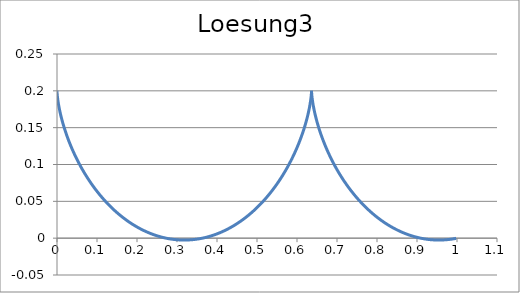
| Category | Loesung3 |
|---|---|
| 0.0 | 0.2 |
| 1.350358627920312e-07 | 0.2 |
| 1.0802220869125487e-06 | 0.2 |
| 3.6453849843475664e-06 | 0.2 |
| 8.639702898011676e-06 | 0.2 |
| 1.687138254120537e-05 | 0.199 |
| 2.9147335725695078e-05 | 0.199 |
| 4.627285660776096e-05 | 0.199 |
| 6.905129958125677e-05 | 0.199 |
| 9.828375794657843e-05 | 0.198 |
| 0.00013476874348401365 | 0.198 |
| 0.00017930186705967618 | 0.198 |
| 0.00023267552039178043 | 0.197 |
| 0.0002956785591045027 | 0.197 |
| 0.00036909598719626414 | 0.196 |
| 0.0004537086430485867 | 0.195 |
| 0.0005502928871011515 | 0.195 |
| 0.0006596202913179884 | 0.194 |
| 0.0007824573305689601 | 0.194 |
| 0.0009195650760500436 | 0.193 |
| 0.0010716988908650023 | 0.192 |
| 0.0012396081278902092 | 0.191 |
| 0.0014240358300434779 | 0.19 |
| 0.0016257184330768328 | 0.189 |
| 0.0018453854710119917 | 0.189 |
| 0.002083759284336518 | 0.188 |
| 0.0023415547310772214 | 0.187 |
| 0.0026194789008665057 | 0.186 |
| 0.0029182308321159525 | 0.185 |
| 0.0032385012324102043 | 0.183 |
| 0.0035809722022332644 | 0.182 |
| 0.003946316962137287 | 0.181 |
| 0.004335199583463373 | 0.18 |
| 0.004748274722721914 | 0.179 |
| 0.005186187359738653 | 0.177 |
| 0.005649572539671434 | 0.176 |
| 0.006139055119000535 | 0.175 |
| 0.006655249515594441 | 0.174 |
| 0.007198759462950897 | 0.172 |
| 0.007770177768711531 | 0.171 |
| 0.008370086077546713 | 0.169 |
| 0.008999054638505468 | 0.168 |
| 0.009657642076923408 | 0.166 |
| 0.0103463951709801 | 0.165 |
| 0.011065848632995038 | 0.163 |
| 0.01181652489554988 | 0.162 |
| 0.012598933902522359 | 0.16 |
| 0.013413572905115531 | 0.158 |
| 0.01426092626296395 | 0.157 |
| 0.015141465250396243 | 0.155 |
| 0.016055647867931677 | 0.153 |
| 0.017003918659086036 | 0.152 |
| 0.01798670853256019 | 0.15 |
| 0.019004434589882307 | 0.148 |
| 0.020057499958572825 | 0.146 |
| 0.02114629363089883 | 0.145 |
| 0.02227119030828232 | 0.143 |
| 0.023432550251424634 | 0.141 |
| 0.02463071913620699 | 0.139 |
| 0.025866027915424708 | 0.137 |
| 0.027138792686410552 | 0.135 |
| 0.028449314564599953 | 0.134 |
| 0.029797879563088926 | 0.132 |
| 0.03118475847823255 | 0.13 |
| 0.032610206781330135 | 0.128 |
| 0.034074464516440015 | 0.126 |
| 0.03557775620436522 | 0.124 |
| 0.03712029075284805 | 0.122 |
| 0.038702261373009854 | 0.12 |
| 0.04032384550206909 | 0.118 |
| 0.041985204732368865 | 0.116 |
| 0.043686484746742076 | 0.114 |
| 0.04542781526024027 | 0.112 |
| 0.04720930996824936 | 0.11 |
| 0.04903106650101298 | 0.108 |
| 0.05089316638458163 | 0.106 |
| 0.05279567500820344 | 0.104 |
| 0.05473864159816927 | 0.102 |
| 0.056722099198122884 | 0.1 |
| 0.05874606465584393 | 0.098 |
| 0.06081053861650904 | 0.096 |
| 0.06291550552243376 | 0.094 |
| 0.06506093361929542 | 0.092 |
| 0.06724677496883455 | 0.09 |
| 0.06947296546802931 | 0.088 |
| 0.07173942487473607 | 0.086 |
| 0.07404605683978505 | 0.084 |
| 0.0763927489455188 | 0.082 |
| 0.07877937275075772 | 0.08 |
| 0.08120578384217479 | 0.078 |
| 0.08367182189205906 | 0.076 |
| 0.08617731072244451 | 0.074 |
| 0.08872205837557891 | 0.072 |
| 0.09130585719070441 | 0.07 |
| 0.09392848388711901 | 0.068 |
| 0.09658969965348595 | 0.066 |
| 0.09928925024335493 | 0.064 |
| 0.1020268660768574 | 0.062 |
| 0.10480226234853492 | 0.06 |
| 0.10761513914125745 | 0.058 |
| 0.11046518154618629 | 0.057 |
| 0.11335205978873343 | 0.055 |
| 0.11627542936046689 | 0.053 |
| 0.11923493115690964 | 0.051 |
| 0.12223019162117642 | 0.049 |
| 0.1252608228933917 | 0.048 |
| 0.12832642296582836 | 0.046 |
| 0.13142657584370537 | 0.044 |
| 0.13456085171158033 | 0.042 |
| 0.13772880710526966 | 0.041 |
| 0.14092998508922874 | 0.039 |
| 0.14416391543931956 | 0.037 |
| 0.14743011483089447 | 0.036 |
| 0.15072808703211937 | 0.034 |
| 0.15405732310246026 | 0.033 |
| 0.1574173015962519 | 0.031 |
| 0.16080748877126982 | 0.03 |
| 0.1642273388022198 | 0.028 |
| 0.16767629399906067 | 0.027 |
| 0.17115378503007309 | 0.025 |
| 0.1746592311495844 | 0.024 |
| 0.17819204043025938 | 0.023 |
| 0.1817516099998631 | 0.021 |
| 0.18533732628240185 | 0.02 |
| 0.18894856524354545 | 0.019 |
| 0.1925846926402325 | 0.018 |
| 0.19624506427435928 | 0.016 |
| 0.1999290262504503 | 0.015 |
| 0.2036359152372078 | 0.014 |
| 0.2073650587328356 | 0.013 |
| 0.2111157753340304 | 0.012 |
| 0.21488737500853458 | 0.011 |
| 0.21867915937113955 | 0.01 |
| 0.22249042196303054 | 0.009 |
| 0.22632044853436087 | 0.008 |
| 0.23016851732994217 | 0.007 |
| 0.23403389937793706 | 0.006 |
| 0.2379158587814379 | 0.005 |
| 0.2418136530128158 | 0.005 |
| 0.24572653321072224 | 0.004 |
| 0.24965374447962285 | 0.003 |
| 0.25359452619174605 | 0.003 |
| 0.2575481122913239 | 0.002 |
| 0.26151373160100433 | 0.001 |
| 0.26549060813031145 | 0.001 |
| 0.2694779613860317 | 0 |
| 0.2734750066844007 | 0 |
| 0.2774809554649663 | -0.001 |
| 0.281495015606002 | -0.001 |
| 0.2855163917413453 | -0.001 |
| 0.2895442855785337 | -0.002 |
| 0.2935778962181106 | -0.002 |
| 0.29761642047397485 | -0.002 |
| 0.30165905319464426 | -0.002 |
| 0.3057049875853055 | -0.002 |
| 0.3097534155305212 | -0.002 |
| 0.3138035279174656 | -0.003 |
| 0.31785451495955835 | -0.003 |
| 0.3219055665203691 | -0.003 |
| 0.32595587243766067 | -0.002 |
| 0.33000462284744336 | -0.002 |
| 0.3340510085079097 | -0.002 |
| 0.3380942211231205 | -0.002 |
| 0.3421334536663123 | -0.002 |
| 0.34616790070269754 | -0.002 |
| 0.3501967587116273 | -0.001 |
| 0.3542192264079894 | -0.001 |
| 0.35823450506271126 | -0.001 |
| 0.3622417988222413 | 0 |
| 0.3662403150268793 | 0 |
| 0.37022926452783017 | 0.001 |
| 0.3742078620028528 | 0.001 |
| 0.3781753262703782 | 0.002 |
| 0.3821308806019721 | 0.003 |
| 0.38607375303301567 | 0.003 |
| 0.39000317667148143 | 0.004 |
| 0.3939183900046794 | 0.005 |
| 0.3978186372038523 | 0.005 |
| 0.401703168426497 | 0.006 |
| 0.40557124011629136 | 0.007 |
| 0.409422115300507 | 0.008 |
| 0.4132550638847882 | 0.009 |
| 0.41706936294518066 | 0.01 |
| 0.42086429701729067 | 0.011 |
| 0.42463915838246163 | 0.012 |
| 0.4283932473508522 | 0.013 |
| 0.43212587254130275 | 0.014 |
| 0.4358363511578788 | 0.015 |
| 0.43952400926297963 | 0.016 |
| 0.4431881820469055 | 0.017 |
| 0.4468282140937717 | 0.019 |
| 0.4504434596436662 | 0.02 |
| 0.45403328285094585 | 0.021 |
| 0.4575970580385651 | 0.022 |
| 0.4611341699483393 | 0.024 |
| 0.46464401398703903 | 0.025 |
| 0.4681259964682202 | 0.027 |
| 0.4715795348496899 | 0.028 |
| 0.475004057966516 | 0.03 |
| 0.47839900625948545 | 0.031 |
| 0.4817638319989202 | 0.033 |
| 0.485097999503762 | 0.034 |
| 0.48840098535583804 | 0.036 |
| 0.49167227860922036 | 0.037 |
| 0.4949113809945983 | 0.039 |
| 0.4981178071185788 | 0.041 |
| 0.5012910846578382 | 0.042 |
| 0.5044307545480442 | 0.044 |
| 0.5075363711674766 | 0.046 |
| 0.5106075025152689 | 0.047 |
| 0.5136437303842039 | 0.049 |
| 0.5166446505279901 | 0.051 |
| 0.5196098728229562 | 0.053 |
| 0.5225390214240933 | 0.054 |
| 0.5254317349153897 | 0.056 |
| 0.5282876664543921 | 0.058 |
| 0.5311064839109368 | 0.06 |
| 0.5338878699999993 | 0.062 |
| 0.5366315224086023 | 0.064 |
| 0.5393371539167376 | 0.066 |
| 0.5420044925122508 | 0.068 |
| 0.5446332814996412 | 0.07 |
| 0.5472232796027381 | 0.071 |
| 0.5497742610612067 | 0.073 |
| 0.5522860157208505 | 0.075 |
| 0.5547583491176686 | 0.077 |
| 0.5571910825556406 | 0.079 |
| 0.5595840531782011 | 0.081 |
| 0.5619371140333808 | 0.083 |
| 0.5642501341325851 | 0.085 |
| 0.566522998502988 | 0.087 |
| 0.56875560823352 | 0.089 |
| 0.5709478805144302 | 0.091 |
| 0.5730997486704101 | 0.093 |
| 0.5752111621872623 | 0.095 |
| 0.5772820867321059 | 0.097 |
| 0.5793125041671087 | 0.099 |
| 0.5813024125567424 | 0.102 |
| 0.5832518261685569 | 0.104 |
| 0.585160775467473 | 0.106 |
| 0.5870293071035975 | 0.108 |
| 0.5888574838935633 | 0.11 |
| 0.5906453847954033 | 0.112 |
| 0.5923931048769694 | 0.114 |
| 0.5941007552779052 | 0.116 |
| 0.5957684631651926 | 0.118 |
| 0.5973963716822865 | 0.12 |
| 0.5989846398918591 | 0.122 |
| 0.600533442712177 | 0.124 |
| 0.6020429708471363 | 0.126 |
| 0.6035134307099838 | 0.127 |
| 0.604945044340754 | 0.129 |
| 0.6063380493174564 | 0.131 |
| 0.6076926986610475 | 0.133 |
| 0.6090092607342252 | 0.135 |
| 0.6102880191340884 | 0.137 |
| 0.6115292725787005 | 0.139 |
| 0.6127333347876077 | 0.141 |
| 0.613900534356354 | 0.143 |
| 0.6150312146250484 | 0.144 |
| 0.6161257335410328 | 0.146 |
| 0.6171844635157081 | 0.148 |
| 0.6182077912755743 | 0.15 |
| 0.6191961177075458 | 0.151 |
| 0.6201498576986011 | 0.153 |
| 0.6210694399698339 | 0.155 |
| 0.6219553069049706 | 0.157 |
| 0.6228079143734224 | 0.158 |
| 0.6236277315479439 | 0.16 |
| 0.6244152407169696 | 0.161 |
| 0.6251709370917061 | 0.163 |
| 0.625895328608053 | 0.165 |
| 0.6265889357234359 | 0.166 |
| 0.6272522912086308 | 0.168 |
| 0.6278859399346619 | 0.169 |
| 0.6284904386548613 | 0.17 |
| 0.6290663557821746 | 0.172 |
| 0.6296142711618038 | 0.173 |
| 0.6301347758392759 | 0.175 |
| 0.6306284718240341 | 0.176 |
| 0.6310959718486409 | 0.177 |
| 0.6315378991236934 | 0.179 |
| 0.6319548870885479 | 0.18 |
| 0.6323475791579519 | 0.181 |
| 0.6327166284646875 | 0.182 |
| 0.6330626975983265 | 0.183 |
| 0.6333864583402032 | 0.184 |
| 0.6336885913947119 | 0.185 |
| 0.6339697861170329 | 0.186 |
| 0.6342307402374002 | 0.187 |
| 0.6344721595820191 | 0.188 |
| 0.6346947577907444 | 0.189 |
| 0.6348992560316343 | 0.19 |
| 0.6350863827124931 | 0.191 |
| 0.6352568731895173 | 0.192 |
| 0.6354114694731631 | 0.193 |
| 0.6355509199313522 | 0.193 |
| 0.6356759789901343 | 0.194 |
| 0.6357874068319276 | 0.195 |
| 0.6358859690914546 | 0.195 |
| 0.6359724365494996 | 0.196 |
| 0.6360475848246063 | 0.197 |
| 0.6361121940628403 | 0.197 |
| 0.6361670486257416 | 0.197 |
| 0.6362129367765904 | 0.198 |
| 0.6362506503651121 | 0.198 |
| 0.636280984510748 | 0.199 |
| 0.636304737284618 | 0.199 |
| 0.6363227093903033 | 0.199 |
| 0.6363357038435751 | 0.199 |
| 0.6363445256511991 | 0.2 |
| 0.636349981488944 | 0.2 |
| 0.636352879378921 | 0.2 |
| 0.6363540283663869 | 0.2 |
| 0.6363542381961357 | 0.2 |
| 0.6363543189886123 | 0.2 |
| 0.6363550809158746 | 0.2 |
| 0.6363573338775357 | 0.2 |
| 0.636361887176815 | 0.2 |
| 0.6363695491968271 | 0.2 |
| 0.6363811270772403 | 0.199 |
| 0.6363974263914306 | 0.199 |
| 0.6364192508242633 | 0.199 |
| 0.6364474018506304 | 0.198 |
| 0.6364826784148705 | 0.198 |
| 0.6365258766112022 | 0.198 |
| 0.6365777893652966 | 0.197 |
| 0.6366392061171183 | 0.197 |
| 0.6367109125051591 | 0.196 |
| 0.636793690052194 | 0.196 |
| 0.6368883158526816 | 0.195 |
| 0.6369955622619372 | 0.194 |
| 0.6371161965872009 | 0.194 |
| 0.637250980780725 | 0.193 |
| 0.637400671135003 | 0.192 |
| 0.6375660179802629 | 0.191 |
| 0.6377477653843452 | 0.19 |
| 0.6379466508550852 | 0.19 |
| 0.6381634050453204 | 0.189 |
| 0.6383987514606385 | 0.188 |
| 0.6386534061699851 | 0.187 |
| 0.6389280775192459 | 0.186 |
| 0.6392234658479172 | 0.185 |
| 0.6395402632089798 | 0.184 |
| 0.6398791530920871 | 0.182 |
| 0.6402408101501783 | 0.181 |
| 0.6406258999296258 | 0.18 |
| 0.6410350786040265 | 0.179 |
| 0.6414689927117398 | 0.178 |
| 0.6419282788972823 | 0.176 |
| 0.6424135636566771 | 0.175 |
| 0.6429254630868648 | 0.174 |
| 0.6434645826392726 | 0.172 |
| 0.6440315168776413 | 0.171 |
| 0.6446268492402084 | 0.17 |
| 0.6452511518063407 | 0.168 |
| 0.6459049850677094 | 0.167 |
| 0.6465888977041016 | 0.165 |
| 0.6473034263639551 | 0.163 |
| 0.6480490954497068 | 0.162 |
| 0.6488264169080386 | 0.16 |
| 0.6496358900251049 | 0.159 |
| 0.6504780012268259 | 0.157 |
| 0.6513532238843226 | 0.155 |
| 0.6522620181245753 | 0.154 |
| 0.6532048306463789 | 0.152 |
| 0.6541820945416694 | 0.15 |
| 0.6551942291222923 | 0.149 |
| 0.6562416397522843 | 0.147 |
| 0.6573247176857328 | 0.145 |
| 0.6584438399102785 | 0.143 |
| 0.6595993689963277 | 0.141 |
| 0.660791652952026 | 0.139 |
| 0.6620210250840622 | 0.138 |
| 0.6632878038643489 | 0.136 |
| 0.6645922928026379 | 0.134 |
| 0.6659347803251205 | 0.132 |
| 0.6673155396590615 | 0.13 |
| 0.6687348287235109 | 0.128 |
| 0.6701928900261405 | 0.126 |
| 0.6716899505662435 | 0.124 |
| 0.6732262217439385 | 0.122 |
| 0.6748018992756115 | 0.12 |
| 0.6764171631156325 | 0.118 |
| 0.6780721773843759 | 0.116 |
| 0.6797670903025745 | 0.114 |
| 0.6815020341320338 | 0.112 |
| 0.6832771251227278 | 0.11 |
| 0.6850924634663019 | 0.108 |
| 0.6869481332559967 | 0.106 |
| 0.6888442024530118 | 0.104 |
| 0.6907807228593233 | 0.102 |
| 0.6927577300969623 | 0.1 |
| 0.6947752435937674 | 0.098 |
| 0.6968332665756134 | 0.096 |
| 0.6989317860651216 | 0.094 |
| 0.7010707728868498 | 0.092 |
| 0.7032501816789629 | 0.09 |
| 0.7054699509113758 | 0.088 |
| 0.7077300029103665 | 0.086 |
| 0.7100302438896425 | 0.084 |
| 0.7123705639878556 | 0.082 |
| 0.7147508373125442 | 0.08 |
| 0.717170921990489 | 0.078 |
| 0.7196306602244599 | 0.076 |
| 0.7221298783563332 | 0.074 |
| 0.7246683869365527 | 0.072 |
| 0.7272459807999064 | 0.07 |
| 0.7298624391475902 | 0.068 |
| 0.7325175256355246 | 0.066 |
| 0.7352109884688891 | 0.064 |
| 0.7379425605028367 | 0.062 |
| 0.7407119593493477 | 0.061 |
| 0.7435188874901825 | 0.059 |
| 0.7463630323958838 | 0.057 |
| 0.7492440666507848 | 0.055 |
| 0.7521616480839703 | 0.053 |
| 0.7551154199061418 | 0.051 |
| 0.7581050108523273 | 0.05 |
| 0.761130035330383 | 0.048 |
| 0.7641900935752244 | 0.046 |
| 0.7672847718087278 | 0.044 |
| 0.7704136424052355 | 0.043 |
| 0.7735762640626007 | 0.041 |
| 0.7767721819787017 | 0.039 |
| 0.7800009280333576 | 0.038 |
| 0.7832620209755701 | 0.036 |
| 0.7865549666160166 | 0.035 |
| 0.7898792580247206 | 0.033 |
| 0.7932343757338151 | 0.031 |
| 0.796619787945325 | 0.03 |
| 0.8000349507438776 | 0.029 |
| 0.803479308314263 | 0.027 |
| 0.80695229316375 | 0.026 |
| 0.810453326349079 | 0.024 |
| 0.8139818177080297 | 0.023 |
| 0.8175371660954784 | 0.022 |
| 0.8211187596238476 | 0.02 |
| 0.8247259759078538 | 0.019 |
| 0.828358182313453 | 0.018 |
| 0.8320147362108862 | 0.017 |
| 0.8356949852317206 | 0.015 |
| 0.8393982675297917 | 0.014 |
| 0.8431239120459304 | 0.013 |
| 0.8468712387763793 | 0.012 |
| 0.8506395590447827 | 0.011 |
| 0.8544281757776514 | 0.01 |
| 0.8582363837831803 | 0.009 |
| 0.8620634700333167 | 0.008 |
| 0.865908713948961 | 0.007 |
| 0.8697713876881901 | 0.006 |
| 0.8736507564373843 | 0.006 |
| 0.8775460787051417 | 0.005 |
| 0.8814566066188663 | 0.004 |
| 0.8853815862239057 | 0.003 |
| 0.8893202577851244 | 0.003 |
| 0.8932718560907865 | 0.002 |
| 0.8972356107586315 | 0.002 |
| 0.9012107465440147 | 0.001 |
| 0.9051964836499973 | 0 |
| 0.909192038039253 | 0 |
| 0.913196621747674 | 0 |
| 0.9172094431995437 | -0.001 |
| 0.9212297075241592 | -0.001 |
| 0.9252566168737671 | -0.001 |
| 0.9292893707426936 | -0.002 |
| 0.9333271662875332 | -0.002 |
| 0.9373691986482792 | -0.002 |
| 0.9414146612702539 | -0.002 |
| 0.9454627462267216 | -0.002 |
| 0.9495126445420464 | -0.003 |
| 0.9535635465152748 | -0.003 |
| 0.9576146420440024 | -0.003 |
| 0.9616651209484058 | -0.002 |
| 0.965714173295302 | -0.002 |
| 0.9697609897221134 | -0.002 |
| 0.9738047617605998 | -0.002 |
| 0.9778446821602359 | -0.002 |
| 0.981879945211101 | -0.002 |
| 0.9859097470661508 | -0.001 |
| 0.9899332860627473 | -0.001 |
| 0.9939497630433123 | -0.001 |
| 0.9979583816749801 | 0 |